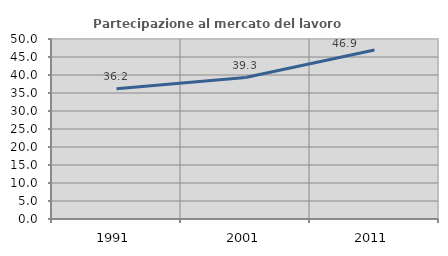
| Category | Partecipazione al mercato del lavoro  femminile |
|---|---|
| 1991.0 | 36.176 |
| 2001.0 | 39.296 |
| 2011.0 | 46.933 |